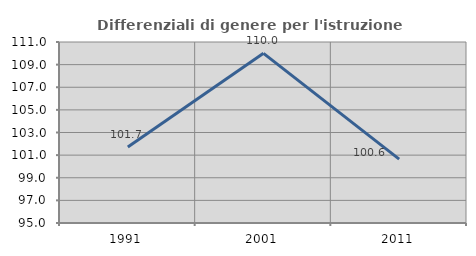
| Category | Differenziali di genere per l'istruzione superiore |
|---|---|
| 1991.0 | 101.718 |
| 2001.0 | 109.996 |
| 2011.0 | 100.643 |